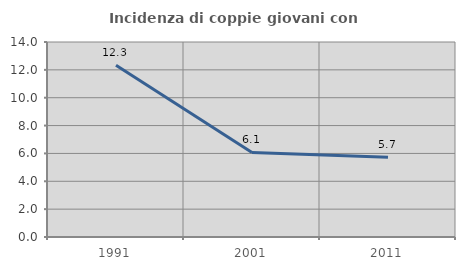
| Category | Incidenza di coppie giovani con figli |
|---|---|
| 1991.0 | 12.329 |
| 2001.0 | 6.069 |
| 2011.0 | 5.722 |